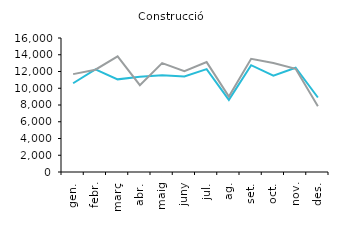
| Category | 2016 | 2017 |
|---|---|---|
| gen. | 10599 | 11686 |
| febr. | 12254 | 12211 |
| març | 11062 | 13799 |
| abr. | 11385 | 10366 |
| maig | 11558 | 12996 |
| juny | 11400 | 12045 |
| jul. | 12285 | 13124 |
| ag. | 8609 | 9004 |
| set. | 12755 | 13515 |
| oct. | 11504 | 13014 |
| nov. | 12450 | 12315 |
| des. | 8895 | 7853 |